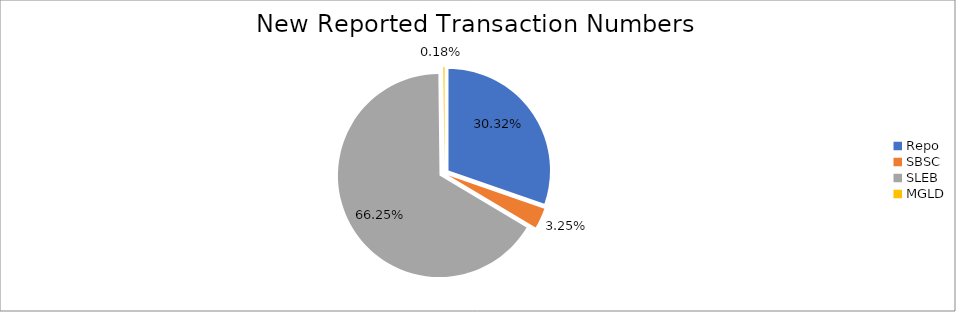
| Category | Series 0 |
|---|---|
| Repo | 397705 |
| SBSC | 42651 |
| SLEB | 869013 |
| MGLD | 2378 |